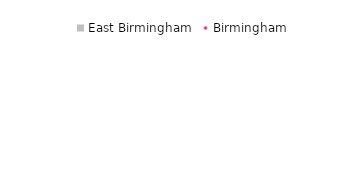
| Category | East Birmingham |
|---|---|
| Owner occupied | -2.623 |
| Rented from local authority | -10.058 |
| Rented from other social registered landlord | 8.432 |
| Privately rented | 36.266 |
| Other | -79.991 |